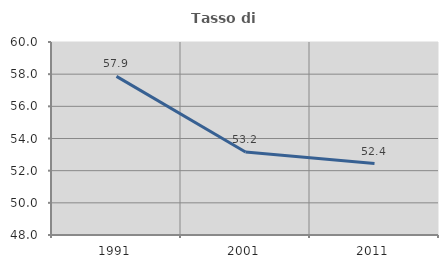
| Category | Tasso di occupazione   |
|---|---|
| 1991.0 | 57.865 |
| 2001.0 | 53.165 |
| 2011.0 | 52.439 |